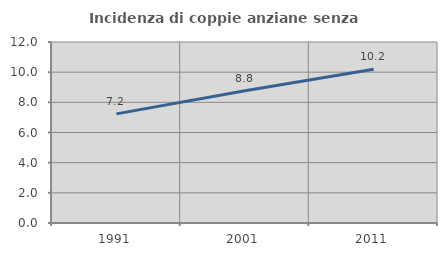
| Category | Incidenza di coppie anziane senza figli  |
|---|---|
| 1991.0 | 7.235 |
| 2001.0 | 8.763 |
| 2011.0 | 10.199 |